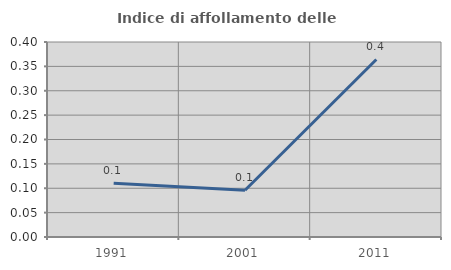
| Category | Indice di affollamento delle abitazioni  |
|---|---|
| 1991.0 | 0.11 |
| 2001.0 | 0.096 |
| 2011.0 | 0.364 |